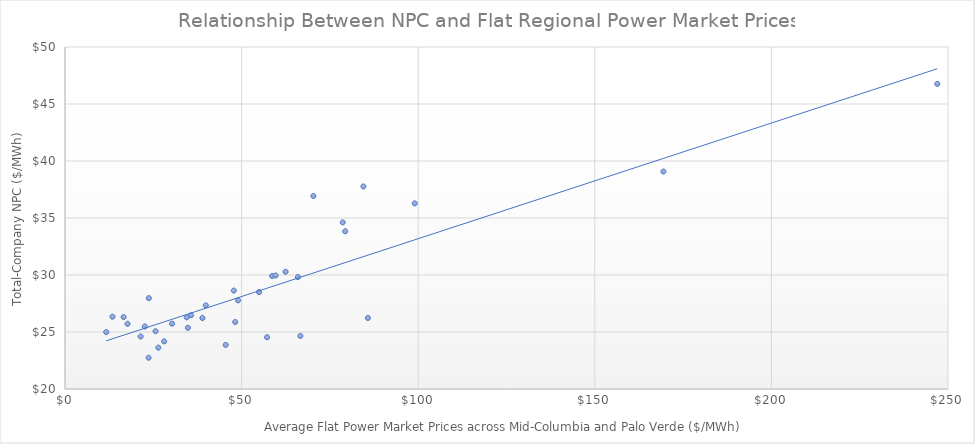
| Category | NPC $/MWh |
|---|---|
| 21.40844086021505 | 24.608 |
| 16.59505747126437 | 26.312 |
| 22.583763440860213 | 25.483 |
| 17.70188888888889 | 25.724 |
| 11.671612903225807 | 24.988 |
| 13.445111111111109 | 26.346 |
| 23.735215053763447 | 27.97 |
| 85.76779569892473 | 26.23 |
| 48.187111111111115 | 25.879 |
| 35.670806451612904 | 26.471 |
| 26.42622222222222 | 23.629 |
| 28.064354838709683 | 24.178 |
| 23.659408602150535 | 22.745 |
| 57.20303571428572 | 24.54 |
| 25.644838709677416 | 25.066 |
| 34.44822222222222 | 26.286 |
| 30.30349462365592 | 25.733 |
| 78.63733333333334 | 34.615 |
| 84.49586021505377 | 37.764 |
| 58.64629032258065 | 29.913 |
| 66.64222222222222 | 24.658 |
| 54.93575268817204 | 28.503 |
| 45.50911111111111 | 23.867 |
| 47.79026881720431 | 28.635 |
| 39.861827956989245 | 27.335 |
| 38.90494047619047 | 26.228 |
| 34.79672043010753 | 25.372 |
| 65.94166666666665 | 29.817 |
| 59.63919354838709 | 29.959 |
| 49.00800000000001 | 27.78 |
| 70.31720430107526 | 36.933 |
| 99.01693548387098 | 36.282 |
| 169.43366666666668 | 39.074 |
| 62.446129032258064 | 30.283 |
| 79.33722222222222 | 33.835 |
| 246.96048387096772 | 46.765 |